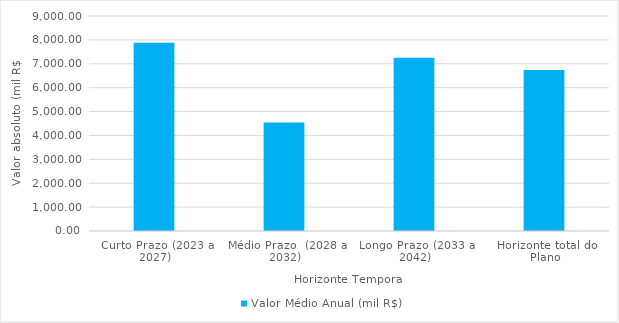
| Category | Valor Médio Anual (mil R$) |
|---|---|
| Curto Prazo (2023 a 2027) | 7883.31 |
| Médio Prazo  (2028 a 2032) | 4546.568 |
| Longo Prazo (2033 a 2042) | 7257.291 |
| Horizonte total do Plano | 6736.115 |